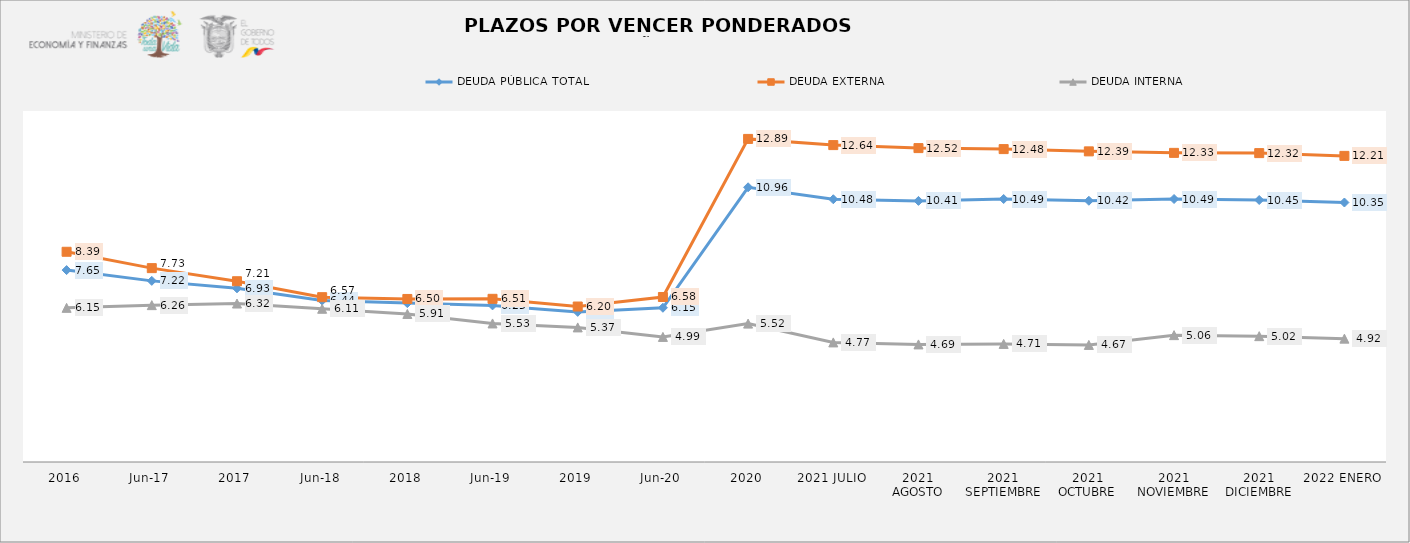
| Category | DEUDA PÚBLICA TOTAL | DEUDA EXTERNA  | DEUDA INTERNA |
|---|---|---|---|
| 2016 | 7.655 | 8.385 | 6.149 |
| jun-17 | 7.224 | 7.733 | 6.257 |
| 2017 | 6.927 | 7.21 | 6.32 |
| jun-18 | 6.439 | 6.574 | 6.111 |
| 2018 | 6.337 | 6.503 | 5.906 |
| jun-19 | 6.246 | 6.509 | 5.526 |
| 2019 | 5.988 | 6.201 | 5.368 |
| jun-20 | 6.152 | 6.581 | 4.989 |
| 2020 | 10.957 | 12.887 | 5.519 |
| 2021 JULIO | 10.48 | 12.64 | 4.77 |
| 2021 AGOSTO | 10.414 | 12.52 | 4.69 |
| 2021 SEPTIEMBRE | 10.49 | 12.48 | 4.71 |
| 2021 OCTUBRE | 10.42 | 12.39 | 4.67 |
| 2021 NOVIEMBRE | 10.49 | 12.33 | 5.06 |
| 2021 DICIEMBRE | 10.45 | 12.32 | 5.02 |
| 2022 ENERO | 10.35 | 12.21 | 4.92 |